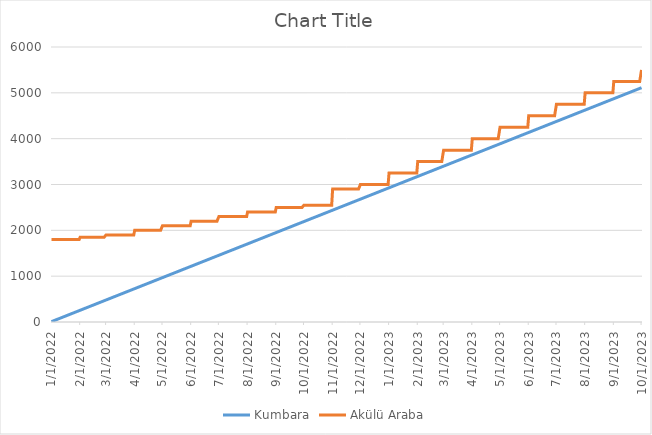
| Category | Kumbara | Akülü Araba |
|---|---|---|
| 1/1/22 | 8 | 1800 |
| 1/2/22 | 16 | 1800 |
| 1/3/22 | 24 | 1800 |
| 1/4/22 | 32 | 1800 |
| 1/5/22 | 40 | 1800 |
| 1/6/22 | 48 | 1800 |
| 1/7/22 | 56 | 1800 |
| 1/8/22 | 64 | 1800 |
| 1/9/22 | 72 | 1800 |
| 1/10/22 | 80 | 1800 |
| 1/11/22 | 88 | 1800 |
| 1/12/22 | 96 | 1800 |
| 1/13/22 | 104 | 1800 |
| 1/14/22 | 112 | 1800 |
| 1/15/22 | 120 | 1800 |
| 1/16/22 | 128 | 1800 |
| 1/17/22 | 136 | 1800 |
| 1/18/22 | 144 | 1800 |
| 1/19/22 | 152 | 1800 |
| 1/20/22 | 160 | 1800 |
| 1/21/22 | 168 | 1800 |
| 1/22/22 | 176 | 1800 |
| 1/23/22 | 184 | 1800 |
| 1/24/22 | 192 | 1800 |
| 1/25/22 | 200 | 1800 |
| 1/26/22 | 208 | 1800 |
| 1/27/22 | 216 | 1800 |
| 1/28/22 | 224 | 1800 |
| 1/29/22 | 232 | 1800 |
| 1/30/22 | 240 | 1800 |
| 1/31/22 | 248 | 1800 |
| 2/1/22 | 256 | 1850 |
| 2/2/22 | 264 | 1850 |
| 2/3/22 | 272 | 1850 |
| 2/4/22 | 280 | 1850 |
| 2/5/22 | 288 | 1850 |
| 2/6/22 | 296 | 1850 |
| 2/7/22 | 304 | 1850 |
| 2/8/22 | 312 | 1850 |
| 2/9/22 | 320 | 1850 |
| 2/10/22 | 328 | 1850 |
| 2/11/22 | 336 | 1850 |
| 2/12/22 | 344 | 1850 |
| 2/13/22 | 352 | 1850 |
| 2/14/22 | 360 | 1850 |
| 2/15/22 | 368 | 1850 |
| 2/16/22 | 376 | 1850 |
| 2/17/22 | 384 | 1850 |
| 2/18/22 | 392 | 1850 |
| 2/19/22 | 400 | 1850 |
| 2/20/22 | 408 | 1850 |
| 2/21/22 | 416 | 1850 |
| 2/22/22 | 424 | 1850 |
| 2/23/22 | 432 | 1850 |
| 2/24/22 | 440 | 1850 |
| 2/25/22 | 448 | 1850 |
| 2/26/22 | 456 | 1850 |
| 2/27/22 | 464 | 1850 |
| 2/28/22 | 472 | 1850 |
| 3/1/22 | 480 | 1900 |
| 3/2/22 | 488 | 1900 |
| 3/3/22 | 496 | 1900 |
| 3/4/22 | 504 | 1900 |
| 3/5/22 | 512 | 1900 |
| 3/6/22 | 520 | 1900 |
| 3/7/22 | 528 | 1900 |
| 3/8/22 | 536 | 1900 |
| 3/9/22 | 544 | 1900 |
| 3/10/22 | 552 | 1900 |
| 3/11/22 | 560 | 1900 |
| 3/12/22 | 568 | 1900 |
| 3/13/22 | 576 | 1900 |
| 3/14/22 | 584 | 1900 |
| 3/15/22 | 592 | 1900 |
| 3/16/22 | 600 | 1900 |
| 3/17/22 | 608 | 1900 |
| 3/18/22 | 616 | 1900 |
| 3/19/22 | 624 | 1900 |
| 3/20/22 | 632 | 1900 |
| 3/21/22 | 640 | 1900 |
| 3/22/22 | 648 | 1900 |
| 3/23/22 | 656 | 1900 |
| 3/24/22 | 664 | 1900 |
| 3/25/22 | 672 | 1900 |
| 3/26/22 | 680 | 1900 |
| 3/27/22 | 688 | 1900 |
| 3/28/22 | 696 | 1900 |
| 3/29/22 | 704 | 1900 |
| 3/30/22 | 712 | 1900 |
| 3/31/22 | 720 | 1900 |
| 4/1/22 | 728 | 2000 |
| 4/2/22 | 736 | 2000 |
| 4/3/22 | 744 | 2000 |
| 4/4/22 | 752 | 2000 |
| 4/5/22 | 760 | 2000 |
| 4/6/22 | 768 | 2000 |
| 4/7/22 | 776 | 2000 |
| 4/8/22 | 784 | 2000 |
| 4/9/22 | 792 | 2000 |
| 4/10/22 | 800 | 2000 |
| 4/11/22 | 808 | 2000 |
| 4/12/22 | 816 | 2000 |
| 4/13/22 | 824 | 2000 |
| 4/14/22 | 832 | 2000 |
| 4/15/22 | 840 | 2000 |
| 4/16/22 | 848 | 2000 |
| 4/17/22 | 856 | 2000 |
| 4/18/22 | 864 | 2000 |
| 4/19/22 | 872 | 2000 |
| 4/20/22 | 880 | 2000 |
| 4/21/22 | 888 | 2000 |
| 4/22/22 | 896 | 2000 |
| 4/23/22 | 904 | 2000 |
| 4/24/22 | 912 | 2000 |
| 4/25/22 | 920 | 2000 |
| 4/26/22 | 928 | 2000 |
| 4/27/22 | 936 | 2000 |
| 4/28/22 | 944 | 2000 |
| 4/29/22 | 952 | 2000 |
| 4/30/22 | 960 | 2000 |
| 5/1/22 | 968 | 2100 |
| 5/2/22 | 976 | 2100 |
| 5/3/22 | 984 | 2100 |
| 5/4/22 | 992 | 2100 |
| 5/5/22 | 1000 | 2100 |
| 5/6/22 | 1008 | 2100 |
| 5/7/22 | 1016 | 2100 |
| 5/8/22 | 1024 | 2100 |
| 5/9/22 | 1032 | 2100 |
| 5/10/22 | 1040 | 2100 |
| 5/11/22 | 1048 | 2100 |
| 5/12/22 | 1056 | 2100 |
| 5/13/22 | 1064 | 2100 |
| 5/14/22 | 1072 | 2100 |
| 5/15/22 | 1080 | 2100 |
| 5/16/22 | 1088 | 2100 |
| 5/17/22 | 1096 | 2100 |
| 5/18/22 | 1104 | 2100 |
| 5/19/22 | 1112 | 2100 |
| 5/20/22 | 1120 | 2100 |
| 5/21/22 | 1128 | 2100 |
| 5/22/22 | 1136 | 2100 |
| 5/23/22 | 1144 | 2100 |
| 5/24/22 | 1152 | 2100 |
| 5/25/22 | 1160 | 2100 |
| 5/26/22 | 1168 | 2100 |
| 5/27/22 | 1176 | 2100 |
| 5/28/22 | 1184 | 2100 |
| 5/29/22 | 1192 | 2100 |
| 5/30/22 | 1200 | 2100 |
| 5/31/22 | 1208 | 2100 |
| 6/1/22 | 1216 | 2200 |
| 6/2/22 | 1224 | 2200 |
| 6/3/22 | 1232 | 2200 |
| 6/4/22 | 1240 | 2200 |
| 6/5/22 | 1248 | 2200 |
| 6/6/22 | 1256 | 2200 |
| 6/7/22 | 1264 | 2200 |
| 6/8/22 | 1272 | 2200 |
| 6/9/22 | 1280 | 2200 |
| 6/10/22 | 1288 | 2200 |
| 6/11/22 | 1296 | 2200 |
| 6/12/22 | 1304 | 2200 |
| 6/13/22 | 1312 | 2200 |
| 6/14/22 | 1320 | 2200 |
| 6/15/22 | 1328 | 2200 |
| 6/16/22 | 1336 | 2200 |
| 6/17/22 | 1344 | 2200 |
| 6/18/22 | 1352 | 2200 |
| 6/19/22 | 1360 | 2200 |
| 6/20/22 | 1368 | 2200 |
| 6/21/22 | 1376 | 2200 |
| 6/22/22 | 1384 | 2200 |
| 6/23/22 | 1392 | 2200 |
| 6/24/22 | 1400 | 2200 |
| 6/25/22 | 1408 | 2200 |
| 6/26/22 | 1416 | 2200 |
| 6/27/22 | 1424 | 2200 |
| 6/28/22 | 1432 | 2200 |
| 6/29/22 | 1440 | 2200 |
| 6/30/22 | 1448 | 2200 |
| 7/1/22 | 1456 | 2300 |
| 7/2/22 | 1464 | 2300 |
| 7/3/22 | 1472 | 2300 |
| 7/4/22 | 1480 | 2300 |
| 7/5/22 | 1488 | 2300 |
| 7/6/22 | 1496 | 2300 |
| 7/7/22 | 1504 | 2300 |
| 7/8/22 | 1512 | 2300 |
| 7/9/22 | 1520 | 2300 |
| 7/10/22 | 1528 | 2300 |
| 7/11/22 | 1536 | 2300 |
| 7/12/22 | 1544 | 2300 |
| 7/13/22 | 1552 | 2300 |
| 7/14/22 | 1560 | 2300 |
| 7/15/22 | 1568 | 2300 |
| 7/16/22 | 1576 | 2300 |
| 7/17/22 | 1584 | 2300 |
| 7/18/22 | 1592 | 2300 |
| 7/19/22 | 1600 | 2300 |
| 7/20/22 | 1608 | 2300 |
| 7/21/22 | 1616 | 2300 |
| 7/22/22 | 1624 | 2300 |
| 7/23/22 | 1632 | 2300 |
| 7/24/22 | 1640 | 2300 |
| 7/25/22 | 1648 | 2300 |
| 7/26/22 | 1656 | 2300 |
| 7/27/22 | 1664 | 2300 |
| 7/28/22 | 1672 | 2300 |
| 7/29/22 | 1680 | 2300 |
| 7/30/22 | 1688 | 2300 |
| 7/31/22 | 1696 | 2300 |
| 8/1/22 | 1704 | 2400 |
| 8/2/22 | 1712 | 2400 |
| 8/3/22 | 1720 | 2400 |
| 8/4/22 | 1728 | 2400 |
| 8/5/22 | 1736 | 2400 |
| 8/6/22 | 1744 | 2400 |
| 8/7/22 | 1752 | 2400 |
| 8/8/22 | 1760 | 2400 |
| 8/9/22 | 1768 | 2400 |
| 8/10/22 | 1776 | 2400 |
| 8/11/22 | 1784 | 2400 |
| 8/12/22 | 1792 | 2400 |
| 8/13/22 | 1800 | 2400 |
| 8/14/22 | 1808 | 2400 |
| 8/15/22 | 1816 | 2400 |
| 8/16/22 | 1824 | 2400 |
| 8/17/22 | 1832 | 2400 |
| 8/18/22 | 1840 | 2400 |
| 8/19/22 | 1848 | 2400 |
| 8/20/22 | 1856 | 2400 |
| 8/21/22 | 1864 | 2400 |
| 8/22/22 | 1872 | 2400 |
| 8/23/22 | 1880 | 2400 |
| 8/24/22 | 1888 | 2400 |
| 8/25/22 | 1896 | 2400 |
| 8/26/22 | 1904 | 2400 |
| 8/27/22 | 1912 | 2400 |
| 8/28/22 | 1920 | 2400 |
| 8/29/22 | 1928 | 2400 |
| 8/30/22 | 1936 | 2400 |
| 8/31/22 | 1944 | 2400 |
| 9/1/22 | 1952 | 2500 |
| 9/2/22 | 1960 | 2500 |
| 9/3/22 | 1968 | 2500 |
| 9/4/22 | 1976 | 2500 |
| 9/5/22 | 1984 | 2500 |
| 9/6/22 | 1992 | 2500 |
| 9/7/22 | 2000 | 2500 |
| 9/8/22 | 2008 | 2500 |
| 9/9/22 | 2016 | 2500 |
| 9/10/22 | 2024 | 2500 |
| 9/11/22 | 2032 | 2500 |
| 9/12/22 | 2040 | 2500 |
| 9/13/22 | 2048 | 2500 |
| 9/14/22 | 2056 | 2500 |
| 9/15/22 | 2064 | 2500 |
| 9/16/22 | 2072 | 2500 |
| 9/17/22 | 2080 | 2500 |
| 9/18/22 | 2088 | 2500 |
| 9/19/22 | 2096 | 2500 |
| 9/20/22 | 2104 | 2500 |
| 9/21/22 | 2112 | 2500 |
| 9/22/22 | 2120 | 2500 |
| 9/23/22 | 2128 | 2500 |
| 9/24/22 | 2136 | 2500 |
| 9/25/22 | 2144 | 2500 |
| 9/26/22 | 2152 | 2500 |
| 9/27/22 | 2160 | 2500 |
| 9/28/22 | 2168 | 2500 |
| 9/29/22 | 2176 | 2500 |
| 9/30/22 | 2184 | 2500 |
| 10/1/22 | 2192 | 2550 |
| 10/2/22 | 2200 | 2550 |
| 10/3/22 | 2208 | 2550 |
| 10/4/22 | 2216 | 2550 |
| 10/5/22 | 2224 | 2550 |
| 10/6/22 | 2232 | 2550 |
| 10/7/22 | 2240 | 2550 |
| 10/8/22 | 2248 | 2550 |
| 10/9/22 | 2256 | 2550 |
| 10/10/22 | 2264 | 2550 |
| 10/11/22 | 2272 | 2550 |
| 10/12/22 | 2280 | 2550 |
| 10/13/22 | 2288 | 2550 |
| 10/14/22 | 2296 | 2550 |
| 10/15/22 | 2304 | 2550 |
| 10/16/22 | 2312 | 2550 |
| 10/17/22 | 2320 | 2550 |
| 10/18/22 | 2328 | 2550 |
| 10/19/22 | 2336 | 2550 |
| 10/20/22 | 2344 | 2550 |
| 10/21/22 | 2352 | 2550 |
| 10/22/22 | 2360 | 2550 |
| 10/23/22 | 2368 | 2550 |
| 10/24/22 | 2376 | 2550 |
| 10/25/22 | 2384 | 2550 |
| 10/26/22 | 2392 | 2550 |
| 10/27/22 | 2400 | 2550 |
| 10/28/22 | 2408 | 2550 |
| 10/29/22 | 2416 | 2550 |
| 10/30/22 | 2424 | 2550 |
| 10/31/22 | 2432 | 2550 |
| 11/1/22 | 2440 | 2900 |
| 11/2/22 | 2448 | 2900 |
| 11/3/22 | 2456 | 2900 |
| 11/4/22 | 2464 | 2900 |
| 11/5/22 | 2472 | 2900 |
| 11/6/22 | 2480 | 2900 |
| 11/7/22 | 2488 | 2900 |
| 11/8/22 | 2496 | 2900 |
| 11/9/22 | 2504 | 2900 |
| 11/10/22 | 2512 | 2900 |
| 11/11/22 | 2520 | 2900 |
| 11/12/22 | 2528 | 2900 |
| 11/13/22 | 2536 | 2900 |
| 11/14/22 | 2544 | 2900 |
| 11/15/22 | 2552 | 2900 |
| 11/16/22 | 2560 | 2900 |
| 11/17/22 | 2568 | 2900 |
| 11/18/22 | 2576 | 2900 |
| 11/19/22 | 2584 | 2900 |
| 11/20/22 | 2592 | 2900 |
| 11/21/22 | 2600 | 2900 |
| 11/22/22 | 2608 | 2900 |
| 11/23/22 | 2616 | 2900 |
| 11/24/22 | 2624 | 2900 |
| 11/25/22 | 2632 | 2900 |
| 11/26/22 | 2640 | 2900 |
| 11/27/22 | 2648 | 2900 |
| 11/28/22 | 2656 | 2900 |
| 11/29/22 | 2664 | 2900 |
| 11/30/22 | 2672 | 2900 |
| 12/1/22 | 2680 | 3000 |
| 12/2/22 | 2688 | 3000 |
| 12/3/22 | 2696 | 3000 |
| 12/4/22 | 2704 | 3000 |
| 12/5/22 | 2712 | 3000 |
| 12/6/22 | 2720 | 3000 |
| 12/7/22 | 2728 | 3000 |
| 12/8/22 | 2736 | 3000 |
| 12/9/22 | 2744 | 3000 |
| 12/10/22 | 2752 | 3000 |
| 12/11/22 | 2760 | 3000 |
| 12/12/22 | 2768 | 3000 |
| 12/13/22 | 2776 | 3000 |
| 12/14/22 | 2784 | 3000 |
| 12/15/22 | 2792 | 3000 |
| 12/16/22 | 2800 | 3000 |
| 12/17/22 | 2808 | 3000 |
| 12/18/22 | 2816 | 3000 |
| 12/19/22 | 2824 | 3000 |
| 12/20/22 | 2832 | 3000 |
| 12/21/22 | 2840 | 3000 |
| 12/22/22 | 2848 | 3000 |
| 12/23/22 | 2856 | 3000 |
| 12/24/22 | 2864 | 3000 |
| 12/25/22 | 2872 | 3000 |
| 12/26/22 | 2880 | 3000 |
| 12/27/22 | 2888 | 3000 |
| 12/28/22 | 2896 | 3000 |
| 12/29/22 | 2904 | 3000 |
| 12/30/22 | 2912 | 3000 |
| 12/31/22 | 2920 | 3000 |
| 1/1/23 | 2928 | 3250 |
| 1/2/23 | 2936 | 3250 |
| 1/3/23 | 2944 | 3250 |
| 1/4/23 | 2952 | 3250 |
| 1/5/23 | 2960 | 3250 |
| 1/6/23 | 2968 | 3250 |
| 1/7/23 | 2976 | 3250 |
| 1/8/23 | 2984 | 3250 |
| 1/9/23 | 2992 | 3250 |
| 1/10/23 | 3000 | 3250 |
| 1/11/23 | 3008 | 3250 |
| 1/12/23 | 3016 | 3250 |
| 1/13/23 | 3024 | 3250 |
| 1/14/23 | 3032 | 3250 |
| 1/15/23 | 3040 | 3250 |
| 1/16/23 | 3048 | 3250 |
| 1/17/23 | 3056 | 3250 |
| 1/18/23 | 3064 | 3250 |
| 1/19/23 | 3072 | 3250 |
| 1/20/23 | 3080 | 3250 |
| 1/21/23 | 3088 | 3250 |
| 1/22/23 | 3096 | 3250 |
| 1/23/23 | 3104 | 3250 |
| 1/24/23 | 3112 | 3250 |
| 1/25/23 | 3120 | 3250 |
| 1/26/23 | 3128 | 3250 |
| 1/27/23 | 3136 | 3250 |
| 1/28/23 | 3144 | 3250 |
| 1/29/23 | 3152 | 3250 |
| 1/30/23 | 3160 | 3250 |
| 1/31/23 | 3168 | 3250 |
| 2/1/23 | 3176 | 3500 |
| 2/2/23 | 3184 | 3500 |
| 2/3/23 | 3192 | 3500 |
| 2/4/23 | 3200 | 3500 |
| 2/5/23 | 3208 | 3500 |
| 2/6/23 | 3216 | 3500 |
| 2/7/23 | 3224 | 3500 |
| 2/8/23 | 3232 | 3500 |
| 2/9/23 | 3240 | 3500 |
| 2/10/23 | 3248 | 3500 |
| 2/11/23 | 3256 | 3500 |
| 2/12/23 | 3264 | 3500 |
| 2/13/23 | 3272 | 3500 |
| 2/14/23 | 3280 | 3500 |
| 2/15/23 | 3288 | 3500 |
| 2/16/23 | 3296 | 3500 |
| 2/17/23 | 3304 | 3500 |
| 2/18/23 | 3312 | 3500 |
| 2/19/23 | 3320 | 3500 |
| 2/20/23 | 3328 | 3500 |
| 2/21/23 | 3336 | 3500 |
| 2/22/23 | 3344 | 3500 |
| 2/23/23 | 3352 | 3500 |
| 2/24/23 | 3360 | 3500 |
| 2/25/23 | 3368 | 3500 |
| 2/26/23 | 3376 | 3500 |
| 2/27/23 | 3384 | 3500 |
| 2/28/23 | 3392 | 3500 |
| 3/1/23 | 3400 | 3750 |
| 3/2/23 | 3408 | 3750 |
| 3/3/23 | 3416 | 3750 |
| 3/4/23 | 3424 | 3750 |
| 3/5/23 | 3432 | 3750 |
| 3/6/23 | 3440 | 3750 |
| 3/7/23 | 3448 | 3750 |
| 3/8/23 | 3456 | 3750 |
| 3/9/23 | 3464 | 3750 |
| 3/10/23 | 3472 | 3750 |
| 3/11/23 | 3480 | 3750 |
| 3/12/23 | 3488 | 3750 |
| 3/13/23 | 3496 | 3750 |
| 3/14/23 | 3504 | 3750 |
| 3/15/23 | 3512 | 3750 |
| 3/16/23 | 3520 | 3750 |
| 3/17/23 | 3528 | 3750 |
| 3/18/23 | 3536 | 3750 |
| 3/19/23 | 3544 | 3750 |
| 3/20/23 | 3552 | 3750 |
| 3/21/23 | 3560 | 3750 |
| 3/22/23 | 3568 | 3750 |
| 3/23/23 | 3576 | 3750 |
| 3/24/23 | 3584 | 3750 |
| 3/25/23 | 3592 | 3750 |
| 3/26/23 | 3600 | 3750 |
| 3/27/23 | 3608 | 3750 |
| 3/28/23 | 3616 | 3750 |
| 3/29/23 | 3624 | 3750 |
| 3/30/23 | 3632 | 3750 |
| 3/31/23 | 3640 | 3750 |
| 4/1/23 | 3648 | 4000 |
| 4/2/23 | 3656 | 4000 |
| 4/3/23 | 3664 | 4000 |
| 4/4/23 | 3672 | 4000 |
| 4/5/23 | 3680 | 4000 |
| 4/6/23 | 3688 | 4000 |
| 4/7/23 | 3696 | 4000 |
| 4/8/23 | 3704 | 4000 |
| 4/9/23 | 3712 | 4000 |
| 4/10/23 | 3720 | 4000 |
| 4/11/23 | 3728 | 4000 |
| 4/12/23 | 3736 | 4000 |
| 4/13/23 | 3744 | 4000 |
| 4/14/23 | 3752 | 4000 |
| 4/15/23 | 3760 | 4000 |
| 4/16/23 | 3768 | 4000 |
| 4/17/23 | 3776 | 4000 |
| 4/18/23 | 3784 | 4000 |
| 4/19/23 | 3792 | 4000 |
| 4/20/23 | 3800 | 4000 |
| 4/21/23 | 3808 | 4000 |
| 4/22/23 | 3816 | 4000 |
| 4/23/23 | 3824 | 4000 |
| 4/24/23 | 3832 | 4000 |
| 4/25/23 | 3840 | 4000 |
| 4/26/23 | 3848 | 4000 |
| 4/27/23 | 3856 | 4000 |
| 4/28/23 | 3864 | 4000 |
| 4/29/23 | 3872 | 4000 |
| 4/30/23 | 3880 | 4000 |
| 5/1/23 | 3888 | 4250 |
| 5/2/23 | 3896 | 4250 |
| 5/3/23 | 3904 | 4250 |
| 5/4/23 | 3912 | 4250 |
| 5/5/23 | 3920 | 4250 |
| 5/6/23 | 3928 | 4250 |
| 5/7/23 | 3936 | 4250 |
| 5/8/23 | 3944 | 4250 |
| 5/9/23 | 3952 | 4250 |
| 5/10/23 | 3960 | 4250 |
| 5/11/23 | 3968 | 4250 |
| 5/12/23 | 3976 | 4250 |
| 5/13/23 | 3984 | 4250 |
| 5/14/23 | 3992 | 4250 |
| 5/15/23 | 4000 | 4250 |
| 5/16/23 | 4008 | 4250 |
| 5/17/23 | 4016 | 4250 |
| 5/18/23 | 4024 | 4250 |
| 5/19/23 | 4032 | 4250 |
| 5/20/23 | 4040 | 4250 |
| 5/21/23 | 4048 | 4250 |
| 5/22/23 | 4056 | 4250 |
| 5/23/23 | 4064 | 4250 |
| 5/24/23 | 4072 | 4250 |
| 5/25/23 | 4080 | 4250 |
| 5/26/23 | 4088 | 4250 |
| 5/27/23 | 4096 | 4250 |
| 5/28/23 | 4104 | 4250 |
| 5/29/23 | 4112 | 4250 |
| 5/30/23 | 4120 | 4250 |
| 5/31/23 | 4128 | 4250 |
| 6/1/23 | 4136 | 4500 |
| 6/2/23 | 4144 | 4500 |
| 6/3/23 | 4152 | 4500 |
| 6/4/23 | 4160 | 4500 |
| 6/5/23 | 4168 | 4500 |
| 6/6/23 | 4176 | 4500 |
| 6/7/23 | 4184 | 4500 |
| 6/8/23 | 4192 | 4500 |
| 6/9/23 | 4200 | 4500 |
| 6/10/23 | 4208 | 4500 |
| 6/11/23 | 4216 | 4500 |
| 6/12/23 | 4224 | 4500 |
| 6/13/23 | 4232 | 4500 |
| 6/14/23 | 4240 | 4500 |
| 6/15/23 | 4248 | 4500 |
| 6/16/23 | 4256 | 4500 |
| 6/17/23 | 4264 | 4500 |
| 6/18/23 | 4272 | 4500 |
| 6/19/23 | 4280 | 4500 |
| 6/20/23 | 4288 | 4500 |
| 6/21/23 | 4296 | 4500 |
| 6/22/23 | 4304 | 4500 |
| 6/23/23 | 4312 | 4500 |
| 6/24/23 | 4320 | 4500 |
| 6/25/23 | 4328 | 4500 |
| 6/26/23 | 4336 | 4500 |
| 6/27/23 | 4344 | 4500 |
| 6/28/23 | 4352 | 4500 |
| 6/29/23 | 4360 | 4500 |
| 6/30/23 | 4368 | 4500 |
| 7/1/23 | 4376 | 4750 |
| 7/2/23 | 4384 | 4750 |
| 7/3/23 | 4392 | 4750 |
| 7/4/23 | 4400 | 4750 |
| 7/5/23 | 4408 | 4750 |
| 7/6/23 | 4416 | 4750 |
| 7/7/23 | 4424 | 4750 |
| 7/8/23 | 4432 | 4750 |
| 7/9/23 | 4440 | 4750 |
| 7/10/23 | 4448 | 4750 |
| 7/11/23 | 4456 | 4750 |
| 7/12/23 | 4464 | 4750 |
| 7/13/23 | 4472 | 4750 |
| 7/14/23 | 4480 | 4750 |
| 7/15/23 | 4488 | 4750 |
| 7/16/23 | 4496 | 4750 |
| 7/17/23 | 4504 | 4750 |
| 7/18/23 | 4512 | 4750 |
| 7/19/23 | 4520 | 4750 |
| 7/20/23 | 4528 | 4750 |
| 7/21/23 | 4536 | 4750 |
| 7/22/23 | 4544 | 4750 |
| 7/23/23 | 4552 | 4750 |
| 7/24/23 | 4560 | 4750 |
| 7/25/23 | 4568 | 4750 |
| 7/26/23 | 4576 | 4750 |
| 7/27/23 | 4584 | 4750 |
| 7/28/23 | 4592 | 4750 |
| 7/29/23 | 4600 | 4750 |
| 7/30/23 | 4608 | 4750 |
| 7/31/23 | 4616 | 4750 |
| 8/1/23 | 4624 | 5000 |
| 8/2/23 | 4632 | 5000 |
| 8/3/23 | 4640 | 5000 |
| 8/4/23 | 4648 | 5000 |
| 8/5/23 | 4656 | 5000 |
| 8/6/23 | 4664 | 5000 |
| 8/7/23 | 4672 | 5000 |
| 8/8/23 | 4680 | 5000 |
| 8/9/23 | 4688 | 5000 |
| 8/10/23 | 4696 | 5000 |
| 8/11/23 | 4704 | 5000 |
| 8/12/23 | 4712 | 5000 |
| 8/13/23 | 4720 | 5000 |
| 8/14/23 | 4728 | 5000 |
| 8/15/23 | 4736 | 5000 |
| 8/16/23 | 4744 | 5000 |
| 8/17/23 | 4752 | 5000 |
| 8/18/23 | 4760 | 5000 |
| 8/19/23 | 4768 | 5000 |
| 8/20/23 | 4776 | 5000 |
| 8/21/23 | 4784 | 5000 |
| 8/22/23 | 4792 | 5000 |
| 8/23/23 | 4800 | 5000 |
| 8/24/23 | 4808 | 5000 |
| 8/25/23 | 4816 | 5000 |
| 8/26/23 | 4824 | 5000 |
| 8/27/23 | 4832 | 5000 |
| 8/28/23 | 4840 | 5000 |
| 8/29/23 | 4848 | 5000 |
| 8/30/23 | 4856 | 5000 |
| 8/31/23 | 4864 | 5000 |
| 9/1/23 | 4872 | 5250 |
| 9/2/23 | 4880 | 5250 |
| 9/3/23 | 4888 | 5250 |
| 9/4/23 | 4896 | 5250 |
| 9/5/23 | 4904 | 5250 |
| 9/6/23 | 4912 | 5250 |
| 9/7/23 | 4920 | 5250 |
| 9/8/23 | 4928 | 5250 |
| 9/9/23 | 4936 | 5250 |
| 9/10/23 | 4944 | 5250 |
| 9/11/23 | 4952 | 5250 |
| 9/12/23 | 4960 | 5250 |
| 9/13/23 | 4968 | 5250 |
| 9/14/23 | 4976 | 5250 |
| 9/15/23 | 4984 | 5250 |
| 9/16/23 | 4992 | 5250 |
| 9/17/23 | 5000 | 5250 |
| 9/18/23 | 5008 | 5250 |
| 9/19/23 | 5016 | 5250 |
| 9/20/23 | 5024 | 5250 |
| 9/21/23 | 5032 | 5250 |
| 9/22/23 | 5040 | 5250 |
| 9/23/23 | 5048 | 5250 |
| 9/24/23 | 5056 | 5250 |
| 9/25/23 | 5064 | 5250 |
| 9/26/23 | 5072 | 5250 |
| 9/27/23 | 5080 | 5250 |
| 9/28/23 | 5088 | 5250 |
| 9/29/23 | 5096 | 5250 |
| 9/30/23 | 5104 | 5250 |
| 10/1/23 | 5112 | 5500 |